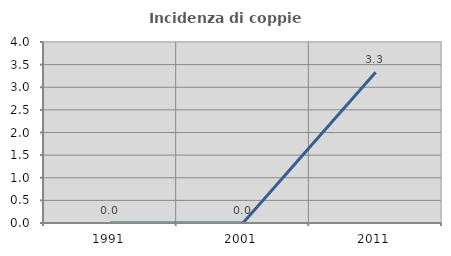
| Category | Incidenza di coppie miste |
|---|---|
| 1991.0 | 0 |
| 2001.0 | 0 |
| 2011.0 | 3.333 |